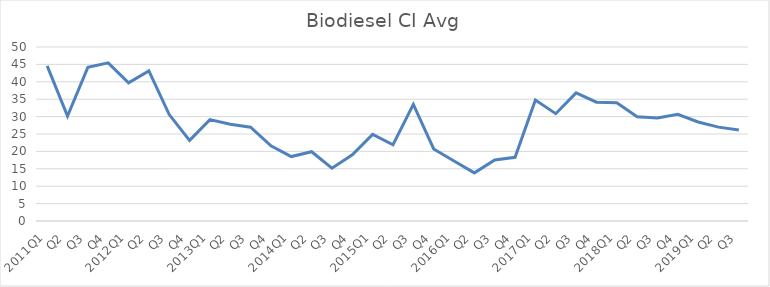
| Category | Series 0 |
|---|---|
| 2011Q1 | 44.57 |
| Q2 | 30.14 |
| Q3 | 44.16 |
| Q4 | 45.45 |
| 2012Q1 | 39.68 |
| Q2 | 43.15 |
| Q3 | 30.58 |
| Q4 | 23.16 |
| 2013Q1 | 29.14 |
| Q2 | 27.78 |
| Q3 | 26.97 |
| Q4 | 21.59 |
| 2014Q1 | 18.52 |
| Q2 | 19.91 |
| Q3 | 15.16 |
| Q4 | 19.04 |
| 2015Q1 | 24.88 |
| Q2 | 21.9 |
| Q3 | 33.51 |
| Q4 | 20.7 |
| 2016Q1 | 17.25 |
| Q2 | 13.83 |
| Q3 | 17.53 |
| Q4 | 18.31 |
| 2017Q1 | 34.76 |
| Q2 | 30.84 |
| Q3 | 36.82 |
| Q4 | 34.15 |
| 2018Q1 | 33.97 |
| Q2 | 29.93 |
| Q3 | 29.61 |
| Q4 | 30.67 |
| 2019Q1 | 28.46 |
| Q2 | 26.98 |
| Q3 | 26.12 |